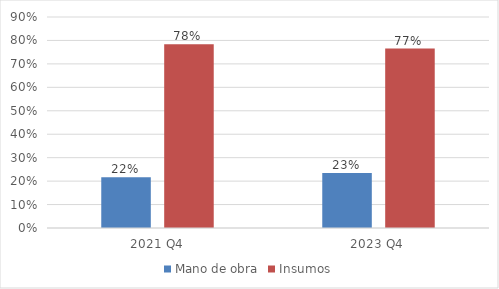
| Category | Mano de obra | Insumos |
|---|---|---|
| 2021 Q4 | 0.216 | 0.784 |
| 2023 Q4 | 0.235 | 0.765 |